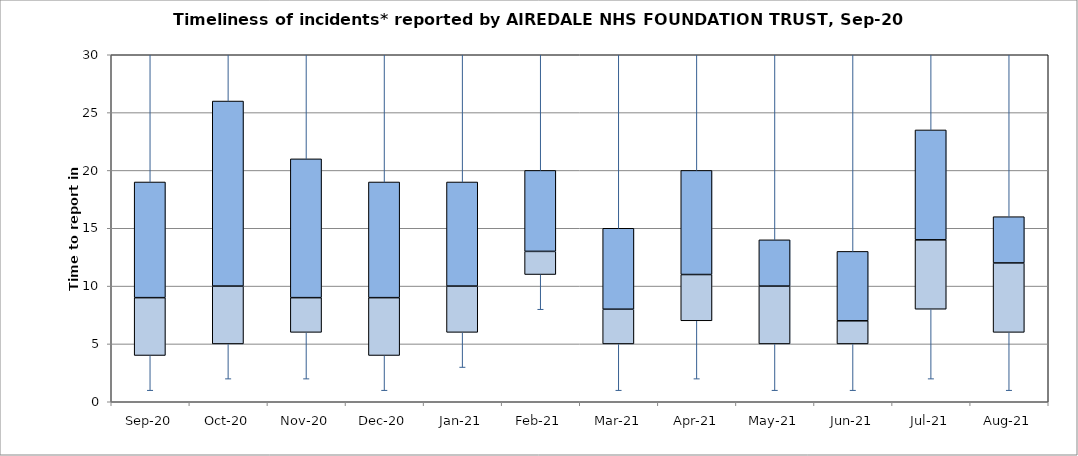
| Category | Series 0 | Series 1 | Series 2 |
|---|---|---|---|
| Sep-20 | 4 | 5 | 10 |
| Oct-20 | 5 | 5 | 16 |
| Nov-20 | 6 | 3 | 12 |
| Dec-20 | 4 | 5 | 10 |
| Jan-21 | 6 | 4 | 9 |
| Feb-21 | 11 | 2 | 7 |
| Mar-21 | 5 | 3 | 7 |
| Apr-21 | 7 | 4 | 9 |
| May-21 | 5 | 5 | 4 |
| Jun-21 | 5 | 2 | 6 |
| Jul-21 | 8 | 6 | 9.5 |
| Aug-21 | 6 | 6 | 4 |